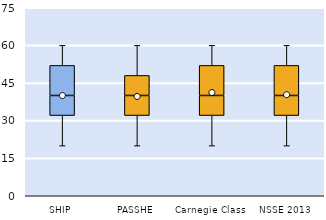
| Category | 25th | 50th | 75th |
|---|---|---|---|
| SHIP | 32 | 8 | 12 |
| PASSHE | 32 | 8 | 8 |
| Carnegie Class | 32 | 8 | 12 |
| NSSE 2013 | 32 | 8 | 12 |